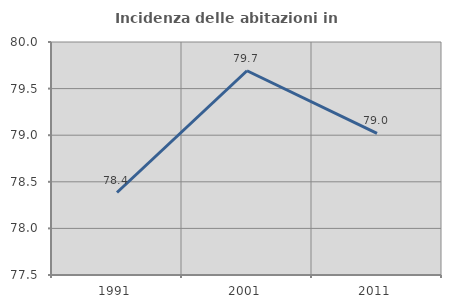
| Category | Incidenza delle abitazioni in proprietà  |
|---|---|
| 1991.0 | 78.385 |
| 2001.0 | 79.692 |
| 2011.0 | 79.019 |